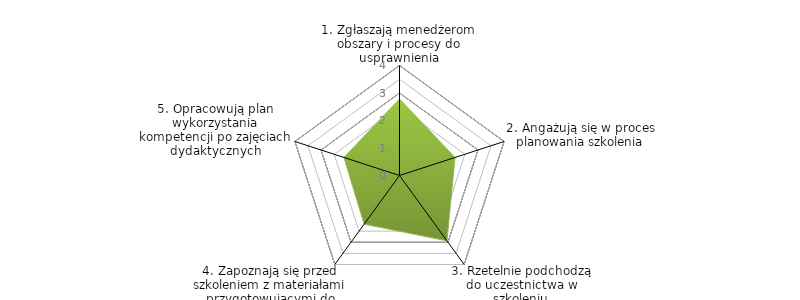
| Category | Series 0 | BENCHMARK |
|---|---|---|
| 1. Zgłaszają menedżerom obszary i procesy do usprawnienia |  | 2.781 |
| 2. Angażują się w proces planowania szkolenia |  | 2.125 |
| 3. Rzetelnie podchodzą do uczestnictwa w szkoleniu |  | 2.938 |
| 4. Zapoznają się przed szkoleniem z materiałami przygotowującymi do zajęć |  | 2.188 |
| 5. Opracowują plan wykorzystania kompetencji po zajęciach dydaktycznych |  | 2.125 |